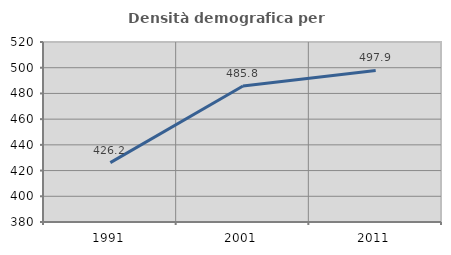
| Category | Densità demografica |
|---|---|
| 1991.0 | 426.214 |
| 2001.0 | 485.819 |
| 2011.0 | 497.891 |